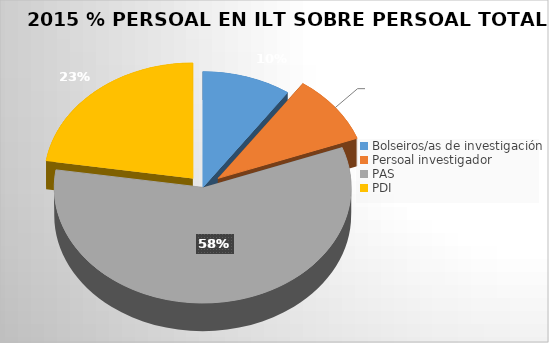
| Category | Series 0 |
|---|---|
| Bolseiros/as de investigación | 0.03 |
| Persoal investigador | 0.03 |
| PAS | 0.18 |
| PDI | 0.07 |